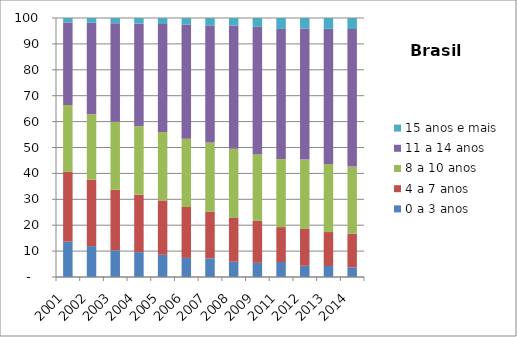
| Category | 0 a 3 anos | 4 a 7 anos | 8 a 10 anos | 11 a 14 anos | 15 anos e mais |
|---|---|---|---|---|---|
| 2001.0 | 13.65 | 26.95 | 25.79 | 31.87 | 1.74 |
| 2002.0 | 11.93 | 25.67 | 25.22 | 35.35 | 1.83 |
| 2003.0 | 10.3 | 23.36 | 26.25 | 38.03 | 2.05 |
| 2004.0 | 9.61 | 22.2 | 26.38 | 39.61 | 2.2 |
| 2005.0 | 8.58 | 20.99 | 26.4 | 41.72 | 2.31 |
| 2006.0 | 7.38 | 19.66 | 26.34 | 44.12 | 2.5 |
| 2007.0 | 7.19 | 18.09 | 26.66 | 45.05 | 3 |
| 2008.0 | 5.89 | 16.92 | 26.7 | 47.6 | 2.89 |
| 2009.0 | 5.46 | 16.22 | 25.73 | 49.16 | 3.43 |
| 2011.0 | 5.79 | 13.48 | 26.26 | 50.28 | 4.19 |
| 2012.0 | 4.33 | 14.41 | 26.59 | 50.61 | 4.05 |
| 2013.0 | 4.25 | 13.11 | 26.28 | 52.16 | 4.21 |
| 2014.0 | 3.7 | 13.08 | 25.85 | 53.12 | 4.26 |